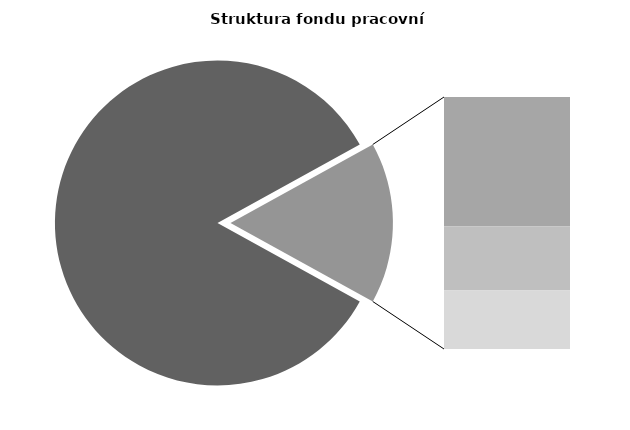
| Category | Series 0 |
|---|---|
| Průměrná měsíční odpracovaná doba bez přesčasu | 142.542 |
| Dovolená | 13.972 |
| Nemoc | 6.944 |
| Jiné | 6.333 |